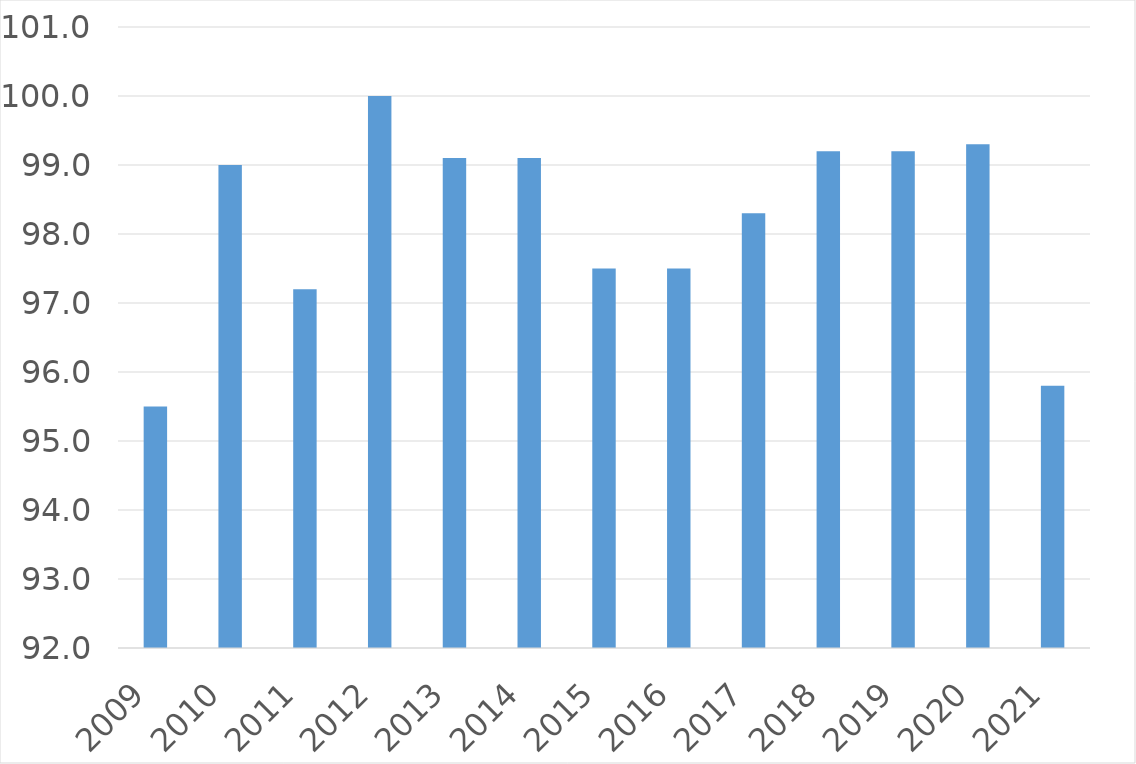
| Category | Series 0 |
|---|---|
| 2009 | 95.5 |
| 2010 | 99 |
| 2011 | 97.2 |
| 2012 | 100 |
| 2013 | 99.1 |
| 2014 | 99.1 |
| 2015 | 97.5 |
| 2016 | 97.5 |
| 2017 | 98.3 |
| 2018 | 99.2 |
| 2019 | 99.2 |
| 2020 | 99.3 |
| 2021 | 95.8 |